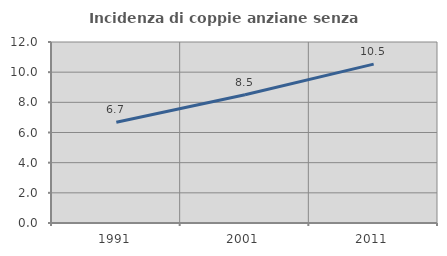
| Category | Incidenza di coppie anziane senza figli  |
|---|---|
| 1991.0 | 6.679 |
| 2001.0 | 8.508 |
| 2011.0 | 10.532 |